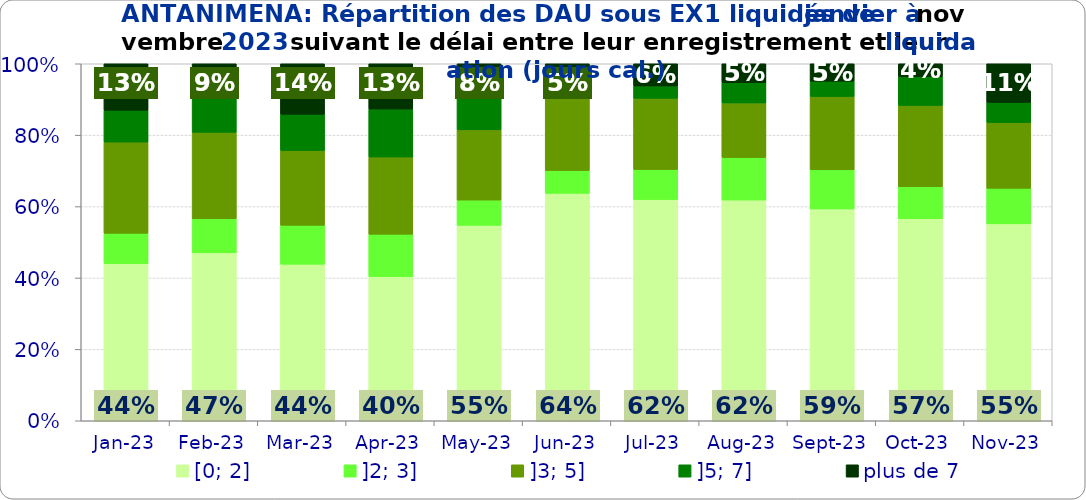
| Category | [0; 2] | ]2; 3] | ]3; 5] | ]5; 7] | plus de 7 |
|---|---|---|---|---|---|
| 2023-01-01 | 0.44 | 0.085 | 0.256 | 0.089 | 0.131 |
| 2023-02-01 | 0.47 | 0.096 | 0.242 | 0.103 | 0.089 |
| 2023-03-01 | 0.439 | 0.109 | 0.209 | 0.101 | 0.142 |
| 2023-04-01 | 0.404 | 0.119 | 0.216 | 0.134 | 0.127 |
| 2023-05-01 | 0.547 | 0.071 | 0.197 | 0.103 | 0.082 |
| 2023-06-01 | 0.637 | 0.064 | 0.206 | 0.046 | 0.047 |
| 2023-07-01 | 0.62 | 0.084 | 0.199 | 0.035 | 0.062 |
| 2023-08-01 | 0.618 | 0.119 | 0.153 | 0.057 | 0.053 |
| 2023-09-01 | 0.593 | 0.109 | 0.206 | 0.043 | 0.049 |
| 2023-10-01 | 0.566 | 0.09 | 0.227 | 0.081 | 0.036 |
| 2023-11-01 | 0.551 | 0.1 | 0.184 | 0.056 | 0.108 |